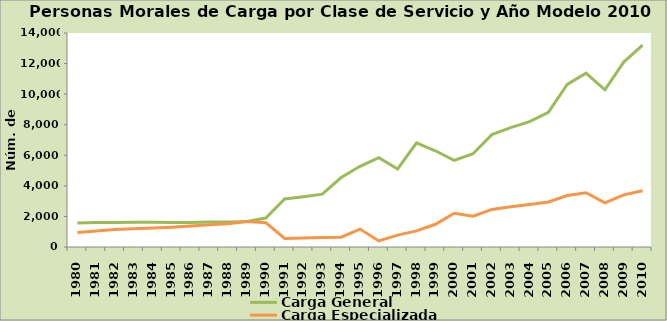
| Category | Carga General | Carga Especializada |
|---|---|---|
| 1980.0 | 1569 | 949 |
| 1981.0 | 1596 | 1046 |
| 1982.0 | 1602 | 1150 |
| 1983.0 | 1627 | 1200 |
| 1984.0 | 1626 | 1239 |
| 1985.0 | 1606 | 1289 |
| 1986.0 | 1609 | 1366 |
| 1987.0 | 1631 | 1456 |
| 1988.0 | 1633 | 1516 |
| 1989.0 | 1662 | 1675 |
| 1990.0 | 1892 | 1590 |
| 1991.0 | 3137 | 563 |
| 1992.0 | 3290 | 590 |
| 1993.0 | 3459 | 617 |
| 1994.0 | 4545 | 642 |
| 1995.0 | 5278 | 1171 |
| 1996.0 | 5841 | 398 |
| 1997.0 | 5107 | 776 |
| 1998.0 | 6812 | 1052 |
| 1999.0 | 6297 | 1486 |
| 2000.0 | 5669 | 2211 |
| 2001.0 | 6101 | 2017 |
| 2002.0 | 7351 | 2459 |
| 2003.0 | 7805 | 2627 |
| 2004.0 | 8202 | 2776 |
| 2005.0 | 8815 | 2943 |
| 2006.0 | 10632 | 3366 |
| 2007.0 | 11373 | 3550 |
| 2008.0 | 10287 | 2894 |
| 2009.0 | 12098 | 3412 |
| 2010.0 | 13210 | 3682 |